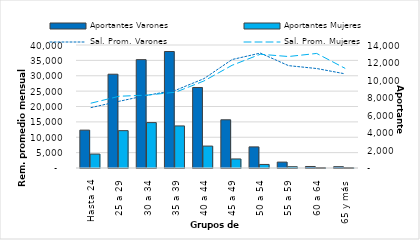
| Category | Aportantes Varones | Aportantes Mujeres |
|---|---|---|
| Hasta 24 | 4310 | 1588 |
| 25 a 29 | 10675 | 4252 |
| 30 a 34 | 12335 | 5167 |
| 35 a 39 | 13259 | 4788 |
| 40 a 44 | 9164 | 2495 |
| 45 a 49 | 5488 | 1029 |
| 50 a 54 | 2402 | 404 |
| 55 a 59 | 672 | 145 |
| 60 a 64 | 171 | 54 |
| 65 y más | 149 | 46 |